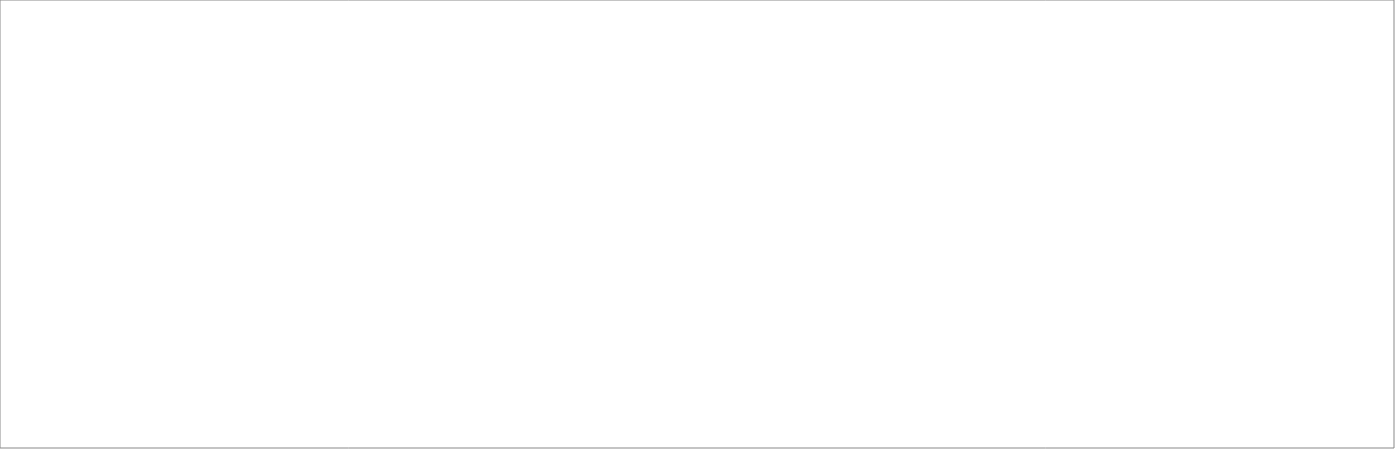
| Category | Construcción |
|---|---|
| 2018_I | 4385.734 |
| 2018_II | 5017.59 |
| 2018_III | 5674.24 |
| 2018_IV | 7065.915 |
| 2019_I | 4745.282 |
| 2019_II | 5630.302 |
| 2019_III | 0 |
| 2019_IV | 0 |